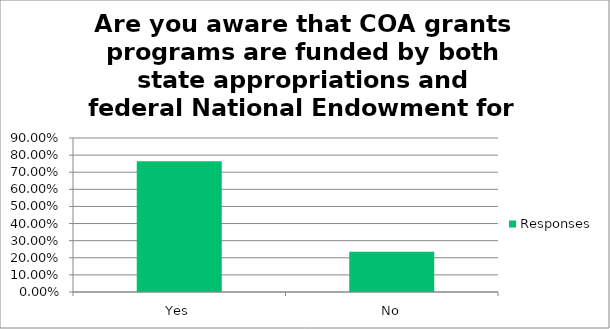
| Category | Responses |
|---|---|
| Yes | 0.765 |
| No | 0.236 |